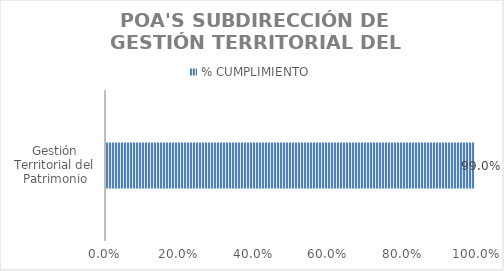
| Category | % CUMPLIMIENTO |
|---|---|
| Gestión Territorial del Patrimonio | 0.99 |